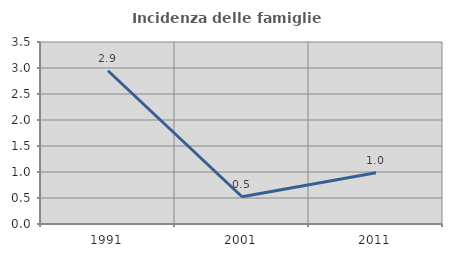
| Category | Incidenza delle famiglie numerose |
|---|---|
| 1991.0 | 2.947 |
| 2001.0 | 0.524 |
| 2011.0 | 0.987 |